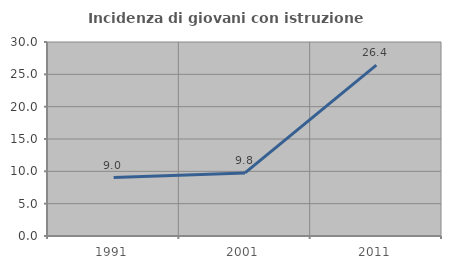
| Category | Incidenza di giovani con istruzione universitaria |
|---|---|
| 1991.0 | 9.045 |
| 2001.0 | 9.756 |
| 2011.0 | 26.432 |